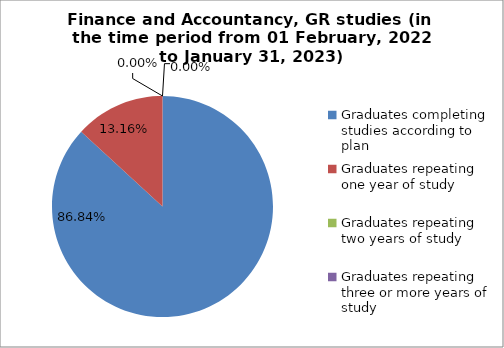
| Category | Series 0 |
|---|---|
| Graduates completing studies according to plan | 86.842 |
| Graduates repeating one year of study | 13.158 |
| Graduates repeating two years of study | 0 |
| Graduates repeating three or more years of study | 0 |